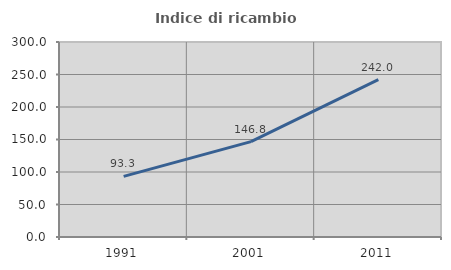
| Category | Indice di ricambio occupazionale  |
|---|---|
| 1991.0 | 93.277 |
| 2001.0 | 146.789 |
| 2011.0 | 241.975 |